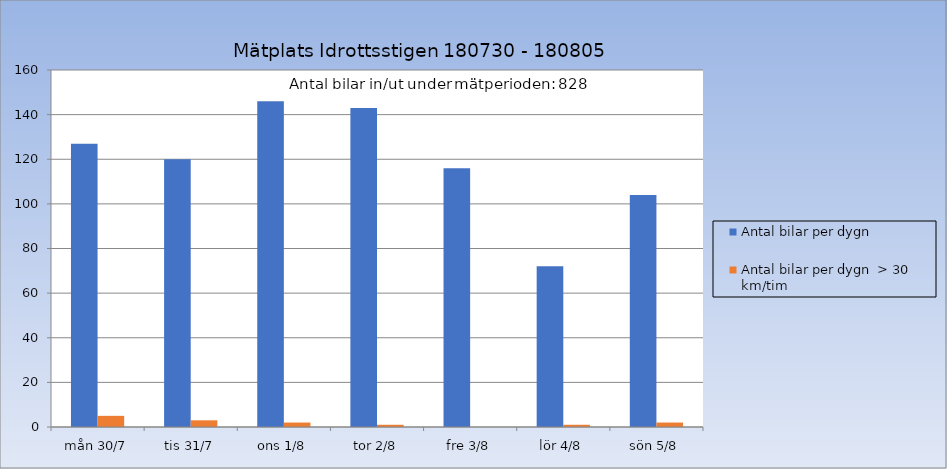
| Category | Antal bilar per dygn | Antal bilar per dygn  > 30 km/tim |
|---|---|---|
| mån 30/7 | 127 | 5 |
| tis 31/7 | 120 | 3 |
| ons 1/8 | 146 | 2 |
| tor 2/8 | 143 | 1 |
| fre 3/8 | 116 | 0 |
| lör 4/8 | 72 | 1 |
| sön 5/8 | 104 | 2 |